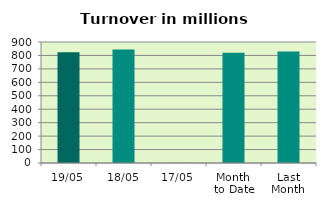
| Category | Series 0 |
|---|---|
| 19/05 | 823.235 |
| 18/05 | 844.434 |
| 17/05 | 0.412 |
| Month 
to Date | 820.76 |
| Last
Month | 829.993 |